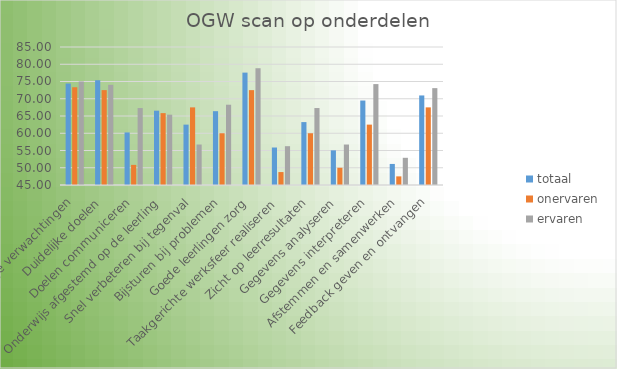
| Category | totaal | onervaren | ervaren |
|---|---|---|---|
| Hoge verwachtingen | 74.412 | 73.333 | 75 |
| Duidelijke doelen | 75.368 | 72.5 | 74.038 |
| Doelen communiceren | 60.242 | 50.833 | 67.308 |
| Onderwijs afgestemd op de leerling | 66.544 | 65.833 | 65.385 |
| Snel verbeteren bij tegenval | 62.5 | 67.5 | 56.731 |
| Bijsturen bij problemen | 66.397 | 60 | 68.269 |
| Goede leerlingen zorg | 77.574 | 72.5 | 78.846 |
| Taakgerichte werksfeer realiseren | 55.867 | 48.75 | 56.25 |
| Zicht op leerresultaten | 63.235 | 60 | 67.308 |
| Gegevens analyseren | 55.042 | 50 | 56.731 |
| Gegevens interpreteren | 69.485 | 62.5 | 74.249 |
| Afstemmen en samenwerken | 51.103 | 47.5 | 52.885 |
| Feedback geven en ontvangen | 70.956 | 67.5 | 73.077 |